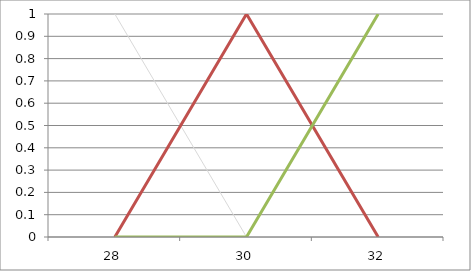
| Category | 28 | 30 | 32 |
|---|---|---|---|
| 28.0 | 1 | 0 | 0 |
| 30.0 | 0 | 1 | 0 |
| 32.0 | 0 | 0 | 1 |